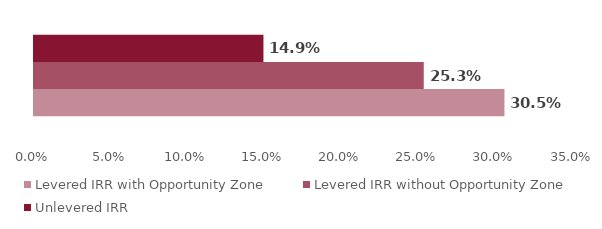
| Category | Levered IRR with Opportunity Zone | Levered IRR without Opportunity Zone | Unlevered IRR |
|---|---|---|---|
| 0 | 0.305 | 0.253 | 0.149 |